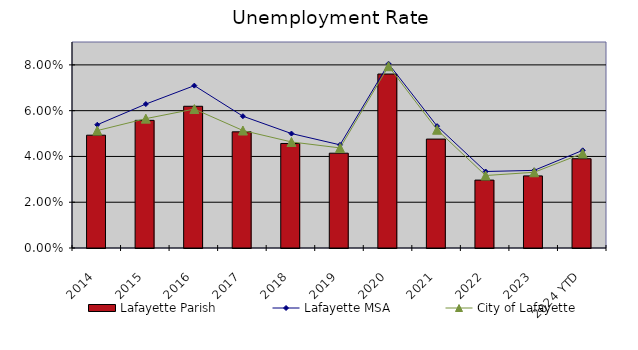
| Category | Lafayette Parish |
|---|---|
| 2014 | 0.049 |
| 2015 | 0.056 |
| 2016 | 0.062 |
| 2017 | 0.051 |
| 2018 | 0.046 |
| 2019 | 0.041 |
| 2020 | 0.076 |
| 2021 | 0.048 |
| 2022 | 0.03 |
| 2023 | 0.032 |
| 2024 YTD | 0.039 |